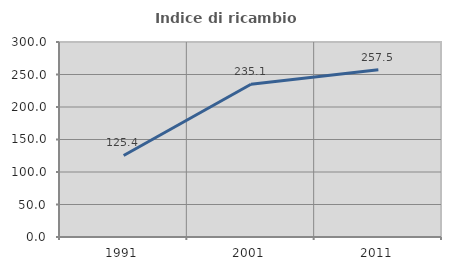
| Category | Indice di ricambio occupazionale  |
|---|---|
| 1991.0 | 125.41 |
| 2001.0 | 235.065 |
| 2011.0 | 257.471 |